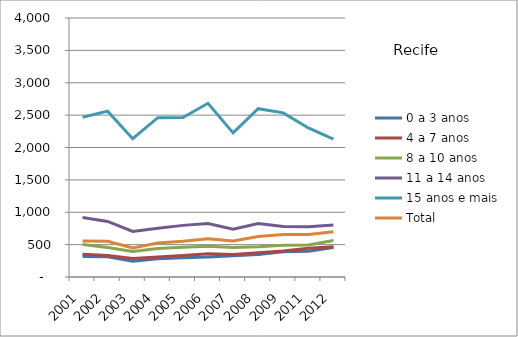
| Category | 0 a 3 anos | 4 a 7 anos | 8 a 10 anos | 11 a 14 anos | 15 anos e mais | Total |
|---|---|---|---|---|---|---|
| 2001.0 | 315.29 | 350.27 | 501.02 | 920.26 | 2467.05 | 556.39 |
| 2002.0 | 314.03 | 330.25 | 457.03 | 858.35 | 2561.6 | 550.43 |
| 2003.0 | 242.77 | 284.35 | 393.74 | 702.64 | 2134.79 | 446.78 |
| 2004.0 | 283.16 | 310.66 | 439.5 | 752.34 | 2461.07 | 526.05 |
| 2005.0 | 297.19 | 330.79 | 458.42 | 797.31 | 2463.47 | 550.4 |
| 2006.0 | 310.36 | 359.41 | 473.29 | 826.45 | 2682.75 | 588.93 |
| 2007.0 | 327.42 | 349.13 | 455.57 | 738 | 2225.86 | 556.28 |
| 2008.0 | 345.85 | 374.85 | 467.92 | 825.06 | 2598.9 | 624.58 |
| 2009.0 | 389.51 | 400.13 | 491.14 | 779.61 | 2534.56 | 656 |
| 2011.0 | 397.56 | 443.25 | 493.31 | 775.09 | 2301.51 | 655.94 |
| 2012.0 | 455.34 | 466.95 | 565.23 | 801.65 | 2127.6 | 697.17 |